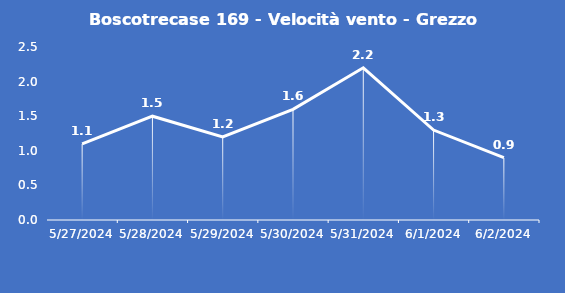
| Category | Boscotrecase 169 - Velocità vento - Grezzo (m/s) |
|---|---|
| 5/27/24 | 1.1 |
| 5/28/24 | 1.5 |
| 5/29/24 | 1.2 |
| 5/30/24 | 1.6 |
| 5/31/24 | 2.2 |
| 6/1/24 | 1.3 |
| 6/2/24 | 0.9 |